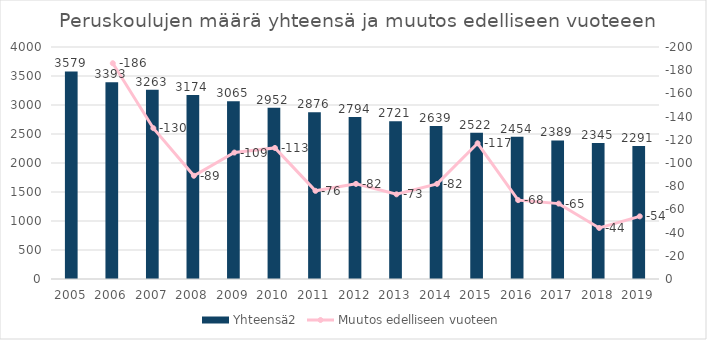
| Category | Yhteensä2 |
|---|---|
| 2005 | 3579 |
| 2006 | 3393 |
| 2007 | 3263 |
| 2008 | 3174 |
| 2009 | 3065 |
| 2010 | 2952 |
| 2011 | 2876 |
| 2012 | 2794 |
| 2013 | 2721 |
| 2014 | 2639 |
| 2015 | 2522 |
| 2016 | 2454 |
| 2017 | 2389 |
| 2018 | 2345 |
| 2019 | 2291 |